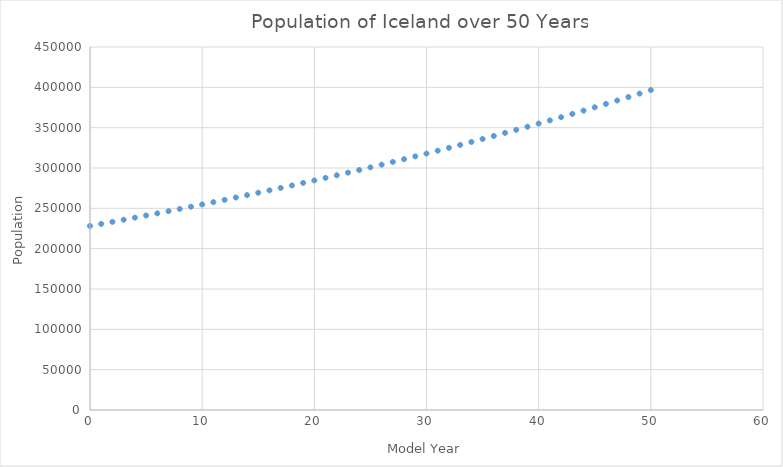
| Category | Series 0 |
|---|---|
| 0.0 | 228138 |
| 1.0 | 230675.211 |
| 2.0 | 233240.64 |
| 3.0 | 235834.599 |
| 4.0 | 238457.407 |
| 5.0 | 241109.385 |
| 6.0 | 243790.856 |
| 7.0 | 246502.148 |
| 8.0 | 249243.594 |
| 9.0 | 252015.529 |
| 10.0 | 254818.292 |
| 11.0 | 257652.225 |
| 12.0 | 260517.675 |
| 13.0 | 263414.993 |
| 14.0 | 266344.533 |
| 15.0 | 269306.654 |
| 16.0 | 272301.718 |
| 17.0 | 275330.091 |
| 18.0 | 278392.144 |
| 19.0 | 281488.251 |
| 20.0 | 284618.791 |
| 21.0 | 287784.147 |
| 22.0 | 290984.706 |
| 23.0 | 294220.86 |
| 24.0 | 297493.004 |
| 25.0 | 300801.539 |
| 26.0 | 304146.87 |
| 27.0 | 307529.405 |
| 28.0 | 310949.559 |
| 29.0 | 314407.75 |
| 30.0 | 317904.4 |
| 31.0 | 321439.938 |
| 32.0 | 325014.797 |
| 33.0 | 328629.412 |
| 34.0 | 332284.227 |
| 35.0 | 335979.689 |
| 36.0 | 339716.25 |
| 37.0 | 343494.366 |
| 38.0 | 347314.5 |
| 39.0 | 351177.119 |
| 40.0 | 355082.696 |
| 41.0 | 359031.708 |
| 42.0 | 363024.639 |
| 43.0 | 367061.977 |
| 44.0 | 371144.216 |
| 45.0 | 375271.855 |
| 46.0 | 379445.399 |
| 47.0 | 383665.358 |
| 48.0 | 387932.249 |
| 49.0 | 392246.594 |
| 50.0 | 396608.921 |